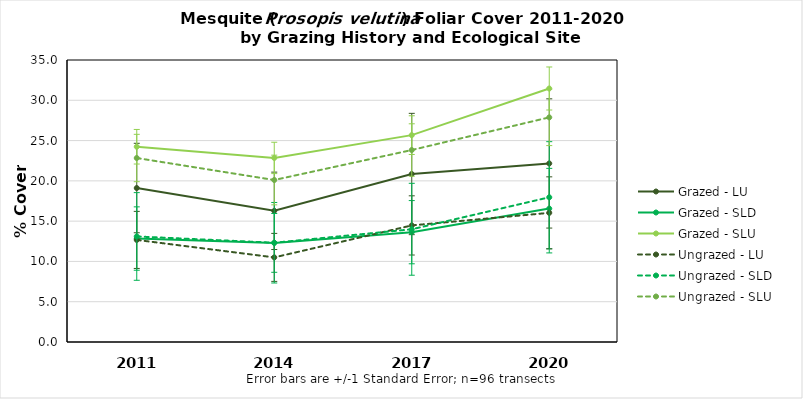
| Category | Grazed - LU | Grazed - SLD | Grazed - SLU | Ungrazed - LU | Ungrazed - SLD | Ungrazed - SLU |
|---|---|---|---|---|---|---|
| 2011.0 | 19.11 | 12.84 | 24.235 | 12.67 | 13.1 | 22.835 |
| 2014.0 | 16.28 | 12.3 | 22.846 | 10.5 | 12.32 | 20.106 |
| 2017.0 | 20.85 | 13.63 | 25.675 | 14.47 | 13.99 | 23.827 |
| 2020.0 | 22.16 | 16.56 | 31.463 | 16.03 | 17.96 | 27.879 |